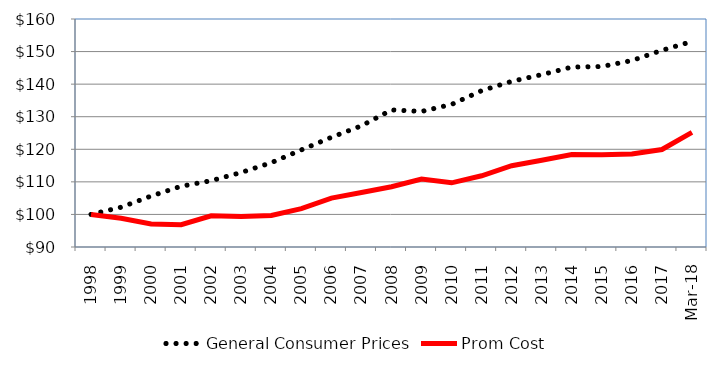
| Category | General Consumer Prices | Prom Cost |
|---|---|---|
| 1998.0 | 100 | 100 |
| 1999.0 | 102.209 | 98.798 |
| 2000.0 | 105.644 | 97.09 |
| 2001.0 | 108.65 | 96.855 |
| 2002.0 | 110.368 | 99.57 |
| 2003.0 | 112.883 | 99.389 |
| 2004.0 | 115.89 | 99.688 |
| 2005.0 | 119.816 | 101.798 |
| 2006.0 | 123.681 | 105.011 |
| 2007.0 | 127.204 | 106.731 |
| 2008.0 | 132.088 | 108.518 |
| 2009.0 | 131.618 | 110.846 |
| 2010.0 | 133.777 | 109.705 |
| 2011.0 | 137.999 | 111.862 |
| 2012.0 | 140.855 | 114.969 |
| 2013.0 | 142.918 | 116.639 |
| 2014.0 | 145.237 | 118.378 |
| 2015.0 | 145.409 | 118.289 |
| 2016.0 | 147.244 | 118.527 |
| 2017.0 | 150.38 | 119.925 |
| 43160.0 | 153.101 | 125.198 |